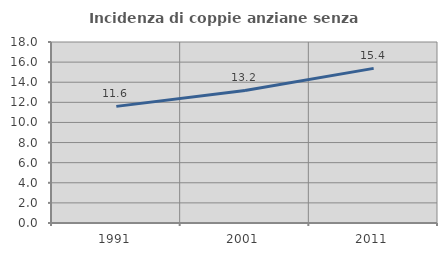
| Category | Incidenza di coppie anziane senza figli  |
|---|---|
| 1991.0 | 11.598 |
| 2001.0 | 13.179 |
| 2011.0 | 15.378 |